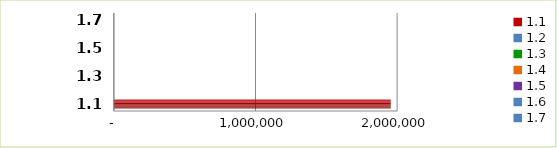
| Category | Series 0 |
|---|---|
| 1.1 | 1955000 |
| 1.2 | 0 |
| 1.3 | 0 |
| 1.4 | 0 |
| 1.5 | 0 |
| 1.6 | 0 |
| 1.7 | 0 |